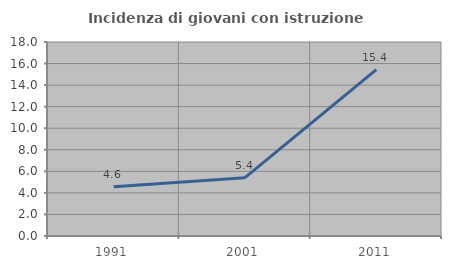
| Category | Incidenza di giovani con istruzione universitaria |
|---|---|
| 1991.0 | 4.563 |
| 2001.0 | 5.414 |
| 2011.0 | 15.435 |